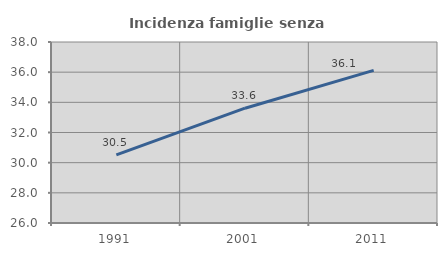
| Category | Incidenza famiglie senza nuclei |
|---|---|
| 1991.0 | 30.514 |
| 2001.0 | 33.611 |
| 2011.0 | 36.115 |